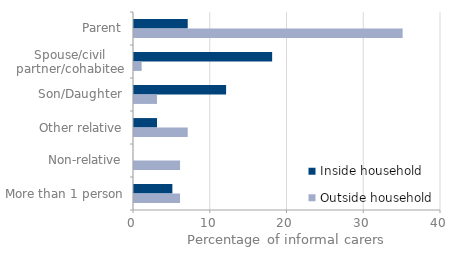
| Category | Inside household | Outside household |
|---|---|---|
| Parent | 7 | 35 |
| Spouse/civil partner/cohabitee | 18 | 1 |
| Son/Daughter | 12 | 3 |
| Other relative | 3 | 7 |
| Non-relative | 0 | 6 |
| More than 1 person | 5 | 6 |